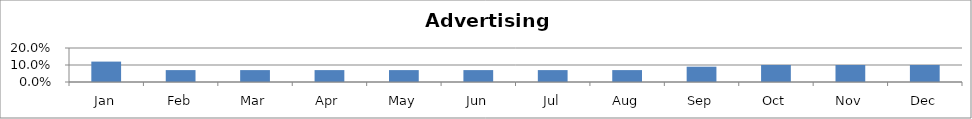
| Category | Series 0 |
|---|---|
| Jan | 0.12 |
| Feb | 0.07 |
| Mar | 0.07 |
| Apr | 0.07 |
| May | 0.07 |
| Jun | 0.07 |
| Jul | 0.07 |
| Aug | 0.07 |
| Sep | 0.09 |
| Oct | 0.1 |
| Nov | 0.1 |
| Dec | 0.1 |